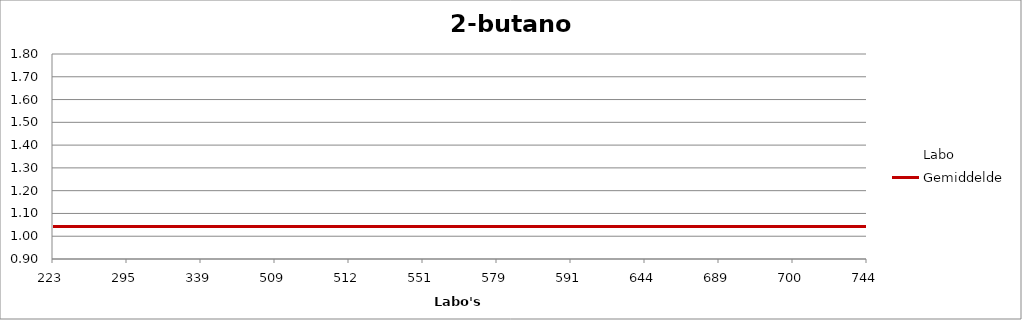
| Category | Labo | Gemiddelde |
|---|---|---|
| 223.0 | 1.159 | 1.043 |
| 295.0 | 0.98 | 1.043 |
| 339.0 | 0.947 | 1.043 |
| 509.0 | 1.052 | 1.043 |
| 512.0 | 0 | 1.043 |
| 551.0 | 1.146 | 1.043 |
| 579.0 | 0.981 | 1.043 |
| 591.0 | 1.02 | 1.043 |
| 644.0 | 0 | 1.043 |
| 689.0 | 1 | 1.043 |
| 700.0 | 0.943 | 1.043 |
| 744.0 | 1.742 | 1.043 |